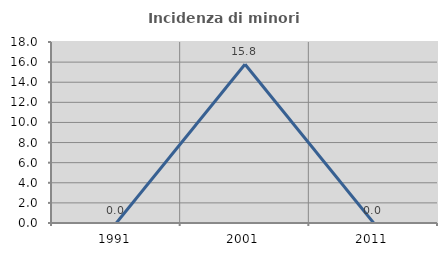
| Category | Incidenza di minori stranieri |
|---|---|
| 1991.0 | 0 |
| 2001.0 | 15.789 |
| 2011.0 | 0 |